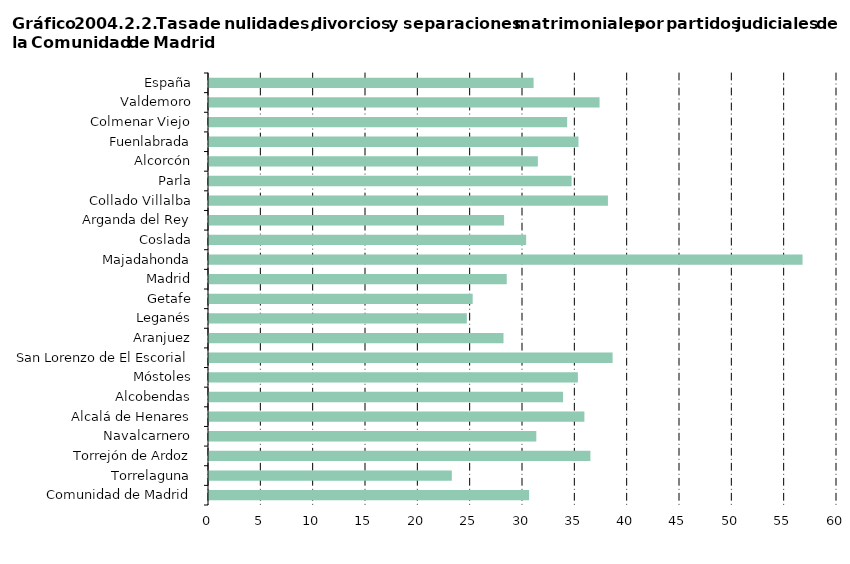
| Category | Series 0 |
|---|---|
| Comunidad de Madrid | 30.583 |
|     Torrelaguna | 23.199 |
|     Torrejón de Ardoz | 36.439 |
|     Navalcarnero | 31.272 |
|     Alcalá de Henares | 35.865 |
|     Alcobendas | 33.828 |
|     Móstoles | 35.244 |
|     San Lorenzo de El Escorial | 38.561 |
|     Aranjuez | 28.136 |
|     Leganés | 24.632 |
|     Getafe | 25.193 |
|     Madrid | 28.447 |
|     Majadahonda | 56.708 |
|     Coslada | 30.3 |
|     Arganda del Rey | 28.195 |
|     Collado Villalba | 38.115 |
|     Parla | 34.641 |
|     Alcorcón | 31.419 |
|     Fuenlabrada | 35.3 |
|     Colmenar Viejo | 34.219 |
|     Valdemoro | 37.313 |
| España | 31.012 |